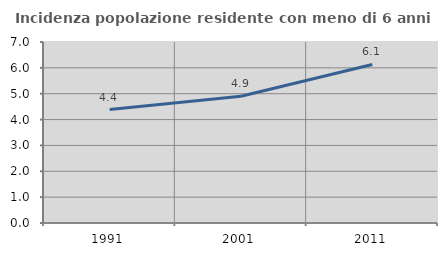
| Category | Incidenza popolazione residente con meno di 6 anni |
|---|---|
| 1991.0 | 4.389 |
| 2001.0 | 4.899 |
| 2011.0 | 6.132 |